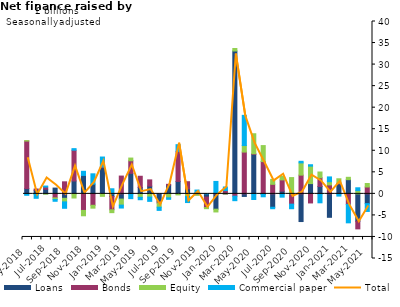
| Category | Loans | Bonds | Equity | Commercial paper |
|---|---|---|---|---|
| May-2018 | 1.226 | 11.031 | 0.099 | -0.33 |
| Jun-2018 | 0.837 | 0.294 | -0.053 | -0.977 |
| Jul-2018 | 1.086 | 0.494 | -0.061 | 0.233 |
| Aug-2018 | 1.339 | -0.932 | -0.359 | -0.431 |
| Sep-2018 | -1.033 | 2.795 | -0.831 | -1.484 |
| Oct-2018 | 2.992 | 7.138 | -0.961 | 0.363 |
| Nov-2018 | 4.279 | -3.846 | -1.24 | 0.958 |
| Dec-2018 | 2.246 | -2.65 | -0.667 | 2.407 |
| Jan-2019 | 6.075 | 0.161 | -0.575 | 2.312 |
| Feb-2019 | -0.609 | -3.084 | -0.667 | 1.181 |
| Mar-2019 | -1.216 | 4.131 | -1.394 | -0.683 |
| Apr-2019 | 4.758 | 2.92 | 0.633 | -1.109 |
| May-2019 | 1.464 | 2.622 | -0.801 | -0.561 |
| Jun-2019 | 1.808 | 1.437 | -0.74 | -1.001 |
| Jul-2019 | -1.857 | -0.281 | -0.954 | -0.742 |
| Aug-2019 | 2.042 | 0.174 | -0.913 | -0.357 |
| Sep-2019 | 2.884 | 6.981 | -0.243 | 1.548 |
| Oct-2019 | 1.17 | 1.651 | -0.602 | -1.416 |
| Nov-2019 | 0.229 | -0.195 | -0.14 | 0.654 |
| Dec-2019 | -0.764 | -2.415 | -0.259 | 0.031 |
| Jan-2020 | -3.554 | 0.155 | -0.644 | 2.731 |
| Feb-2020 | -0.001 | 0.764 | -0.004 | 0.826 |
| Mar-2020 | 33.152 | -0.54 | 0.583 | -1.041 |
| Apr-2020 | -0.597 | 9.698 | 1.513 | 7.014 |
| May-2020 | 9.173 | 0.131 | 4.648 | -1.303 |
| Jun-2020 | -0.116 | 7.494 | 3.709 | -0.564 |
| Jul-2020 | -3.108 | 2.212 | 1.141 | -0.34 |
| Aug-2020 | 0.626 | 2.614 | 0.844 | -0.762 |
| Sep-2020 | -0.267 | -2.122 | 3.778 | -1.058 |
| Oct-2020 | -6.425 | 4.349 | 2.841 | 0.366 |
| Nov-2020 | 2.386 | -2.106 | 4.046 | 0.327 |
| Dec-2020 | 1.718 | 2.015 | 1.338 | -2.076 |
| Jan-2021 | -5.439 | 2.081 | 0.74 | 1.11 |
| Feb-2021 | 2.269 | 0.193 | 1.041 | -0.517 |
| Mar-2021 | 3.294 | -2.452 | 0.549 | -4.272 |
| Apr-2021 | -6.37 | -1.754 | 0.762 | 0.65 |
| May-2021 | -2.263 | 1.596 | 0.805 | -1.817 |